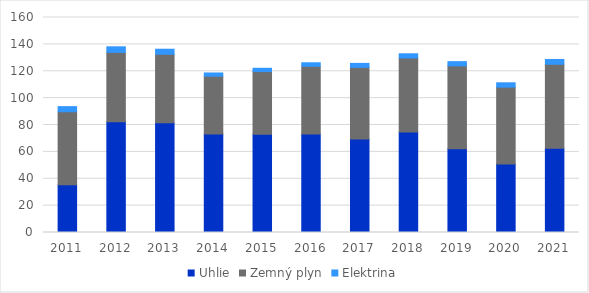
| Category | Uhlie | Zemný plyn | Elektrina |
|---|---|---|---|
| 2011.0 | 35.462 | 54.413 | 3.791 |
| 2012.0 | 82.383 | 51.644 | 4.161 |
| 2013.0 | 81.641 | 51.028 | 3.714 |
| 2014.0 | 73.338 | 42.954 | 2.429 |
| 2015.0 | 73.075 | 46.662 | 2.471 |
| 2016.0 | 73.227 | 50.436 | 2.65 |
| 2017.0 | 69.653 | 53.249 | 2.934 |
| 2018.0 | 74.827 | 55.032 | 3.149 |
| 2019.0 | 62.349 | 61.683 | 3.12 |
| 2020.0 | 50.952 | 57.204 | 3.254 |
| 2021.0 | 62.606 | 62.575 | 3.587 |